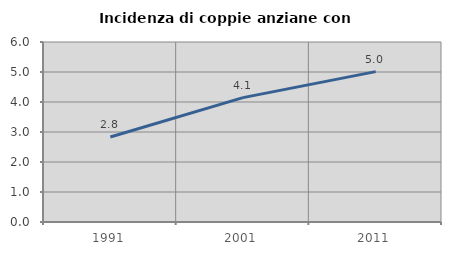
| Category | Incidenza di coppie anziane con figli |
|---|---|
| 1991.0 | 2.835 |
| 2001.0 | 4.146 |
| 2011.0 | 5.012 |